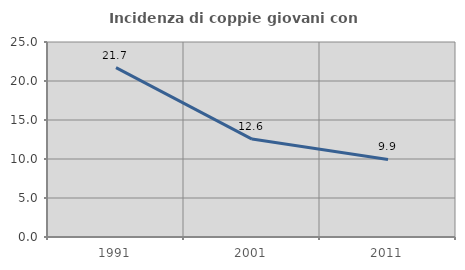
| Category | Incidenza di coppie giovani con figli |
|---|---|
| 1991.0 | 21.72 |
| 2001.0 | 12.551 |
| 2011.0 | 9.949 |